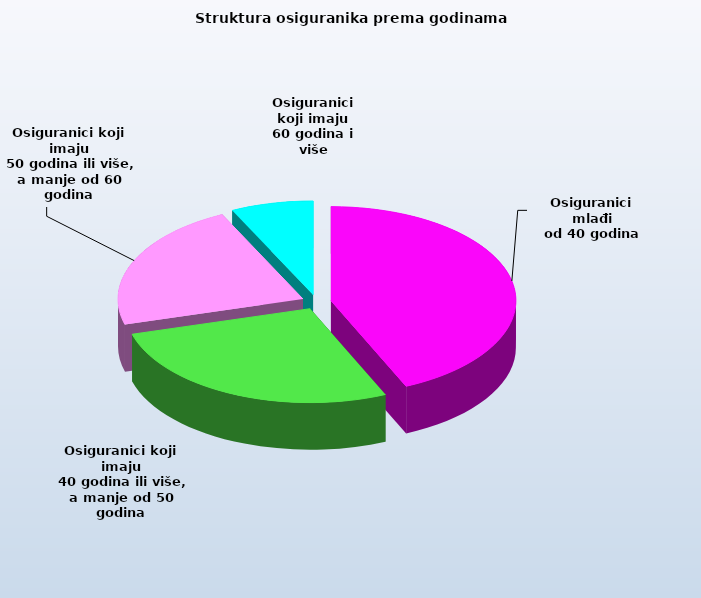
| Category | Series 0 |
|---|---|
| Osiguranici mlađi
od 40 godina | 686025 |
| Osiguranici koji imaju
 40 godina ili više, a manje od 50 godina | 431900 |
| Osiguranici koji imaju
 50 godina ili više, a manje od 60 godina | 351240 |
| Osiguranici koji imaju
60 godina i više | 113966 |